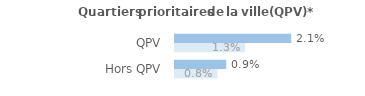
| Category | Series 0 | Series 1 |
|---|---|---|
| QPV | 0.021 | 0.013 |
| Hors QPV | 0.009 | 0.008 |